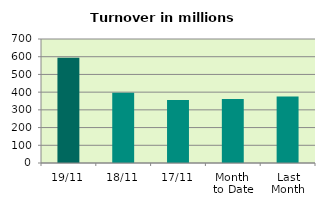
| Category | Series 0 |
|---|---|
| 19/11 | 594.313 |
| 18/11 | 397.217 |
| 17/11 | 354.949 |
| Month 
to Date | 361.958 |
| Last
Month | 375.959 |